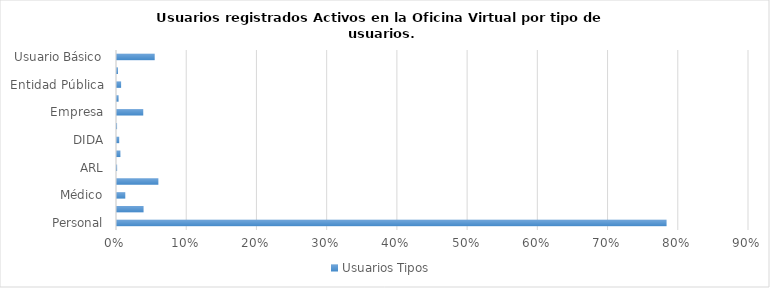
| Category | Usuarios Tipos |
|---|---|
| Personal | 0.783 |
| Promotor | 0.038 |
| Médico | 0.012 |
| ARS | 0.059 |
| ARL | 0 |
| SISALRIL | 0.005 |
| DIDA | 0.003 |
| TSS | 0 |
| Empresa | 0.037 |
| PSS | 0.002 |
| Entidad Pública | 0.006 |
| AEI | 0.001 |
| Usuario Básico | 0.054 |